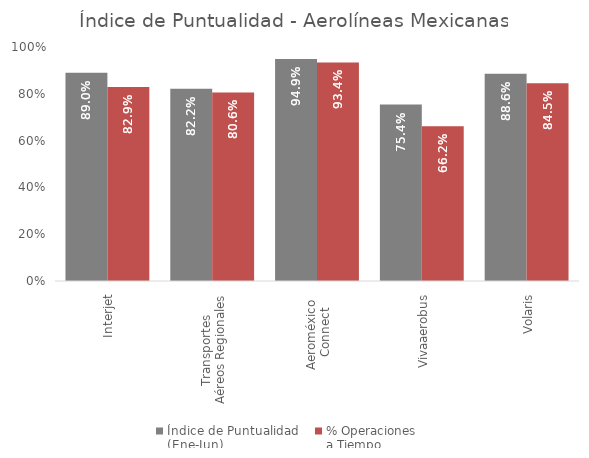
| Category | Índice de Puntualidad
(Ene-Jun) | % Operaciones 
a Tiempo |
|---|---|---|
| Interjet | 0.89 | 0.829 |
| Transportes 
Aéreos Regionales | 0.822 | 0.806 |
| Aeroméxico 
Connect | 0.949 | 0.934 |
| Vivaaerobus | 0.754 | 0.662 |
| Volaris | 0.886 | 0.845 |